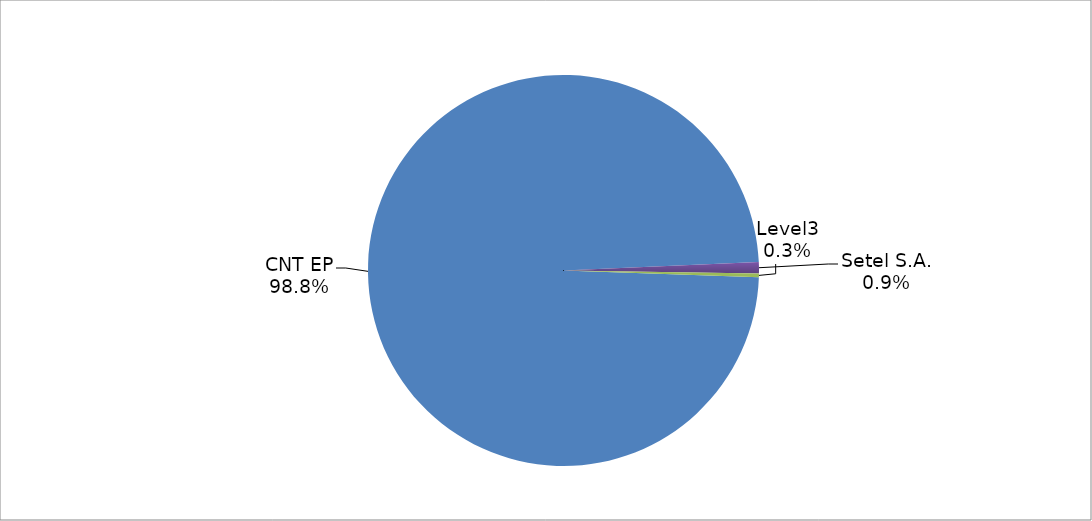
| Category | Series 0 |
|---|---|
| CNT EP | 316 |
| Setel S.A. | 3 |
| Level3 | 1 |